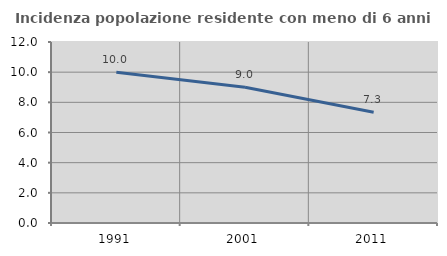
| Category | Incidenza popolazione residente con meno di 6 anni |
|---|---|
| 1991.0 | 10 |
| 2001.0 | 8.994 |
| 2011.0 | 7.336 |